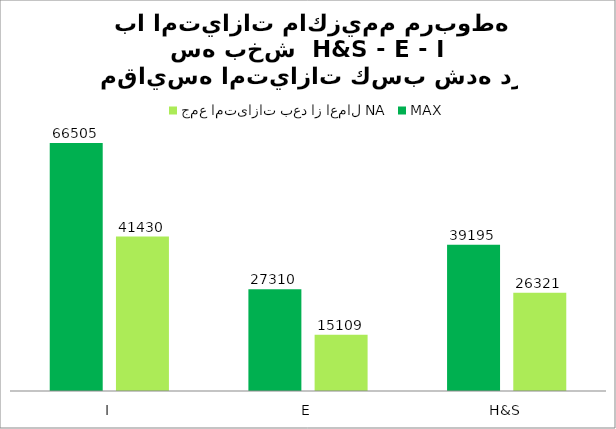
| Category | جمع امتیازات بعد از اعمال NA | MAX |
|---|---|---|
| H&S | 26320.971 | 39195 |
| E | 15108.885 | 27310 |
| I | 41429.856 | 66505 |